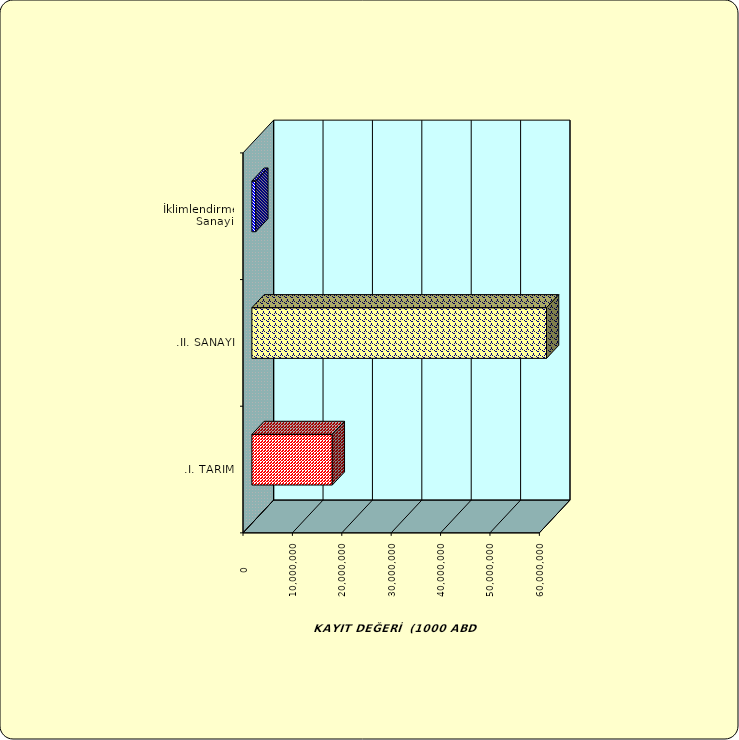
| Category | Series 0 |
|---|---|
| .I. TARIM | 16278676.466 |
| .II. SANAYİ | 59651498.597 |
|  İklimlendirme Sanayii | 795015.678 |